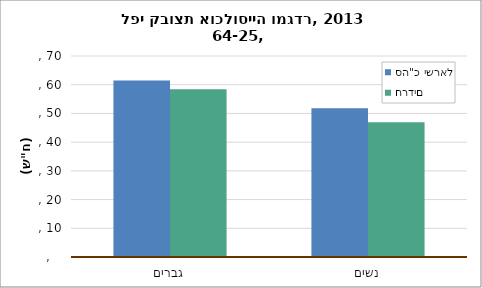
| Category | סה"כ ישראל | חרדים |
|---|---|---|
| גברים | 61.441 | 58.43 |
| נשים | 51.775 | 46.95 |